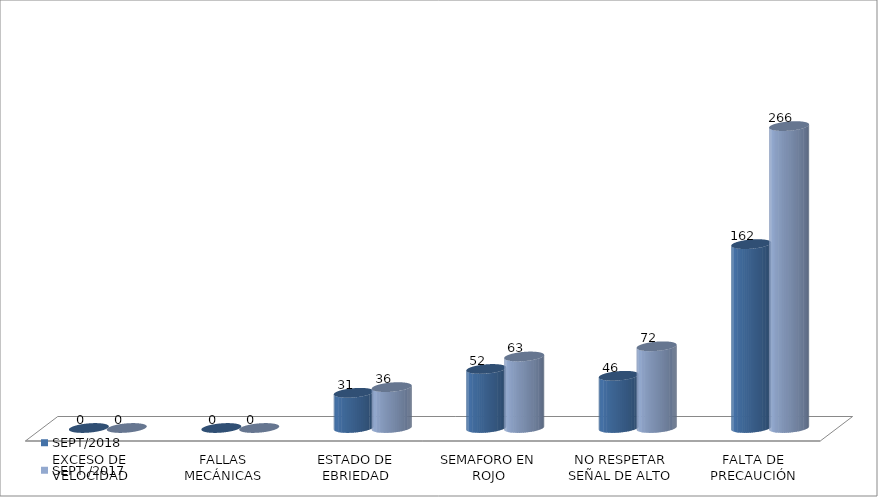
| Category | SEPT/2018 | SEPT /2017 |
|---|---|---|
| EXCESO DE VELOCIDAD | 0 | 0 |
| FALLAS MECÁNICAS | 0 | 0 |
| ESTADO DE EBRIEDAD | 31 | 36 |
| SEMAFORO EN ROJO | 52 | 63 |
| NO RESPETAR SEÑAL DE ALTO | 46 | 72 |
| FALTA DE PRECAUCIÓN | 162 | 266 |